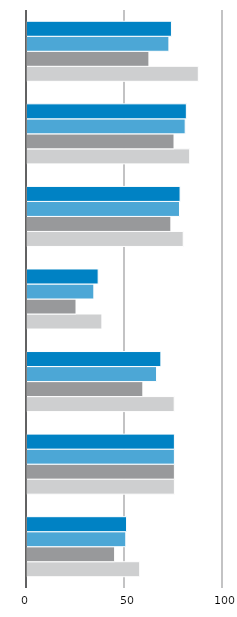
| Category | Summe von Maximum | Summe von Minimum | Summe von Deutschland | Summe von Anteil an den Beschäftigten insg. In % wB |
|---|---|---|---|---|
| 7 | 57.5 | 44.7 | 50.4 | 50.8 |
| 6 | 75.2 | 75.2 | 75.2 | 75.2 |
| 5 | 75.1 | 59.1 | 66.1 | 68.3 |
| 4 | 38.2 | 25 | 34.1 | 36.3 |
| 3 | 79.7 | 73.4 | 77.8 | 78.1 |
| 2 | 83 | 75 | 80.7 | 81.3 |
| 1 | 87.4 | 62.2 | 72.4 | 73.7 |